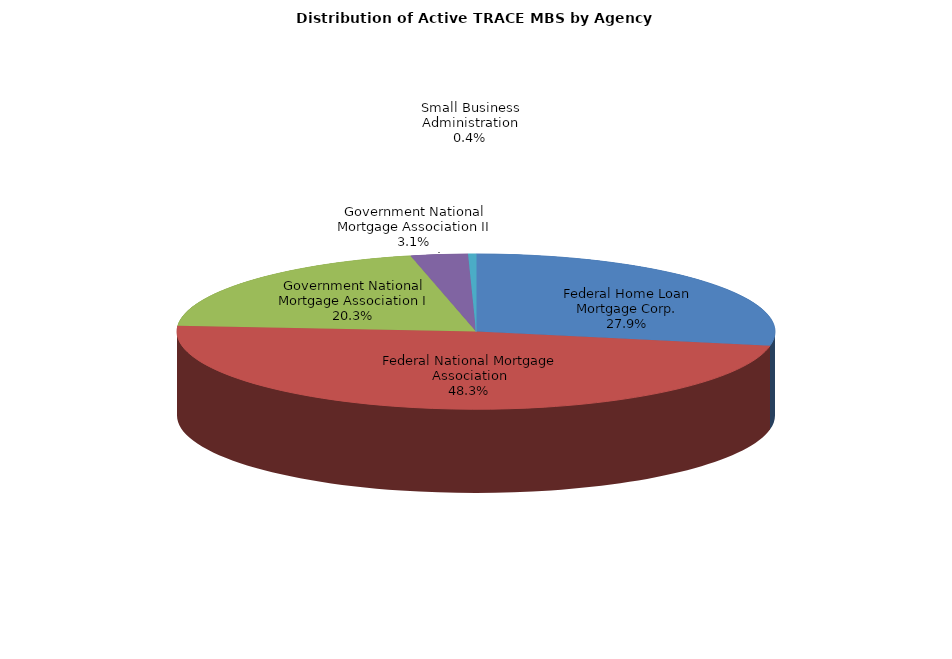
| Category | Series 0 |
|---|---|
| Federal Home Loan Mortgage Corp. | 296227 |
| Federal National Mortgage Association | 512164 |
| Government National Mortgage Association I | 215055 |
| Government National Mortgage Association II | 32677 |
| Small Business Administration | 4516 |